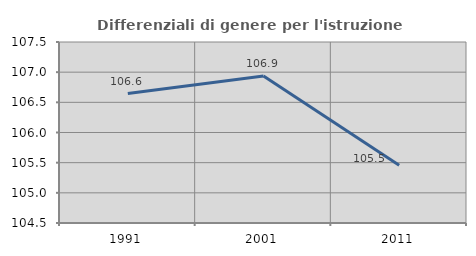
| Category | Differenziali di genere per l'istruzione superiore |
|---|---|
| 1991.0 | 106.645 |
| 2001.0 | 106.935 |
| 2011.0 | 105.457 |